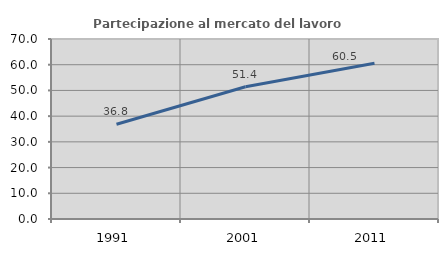
| Category | Partecipazione al mercato del lavoro  femminile |
|---|---|
| 1991.0 | 36.835 |
| 2001.0 | 51.406 |
| 2011.0 | 60.541 |